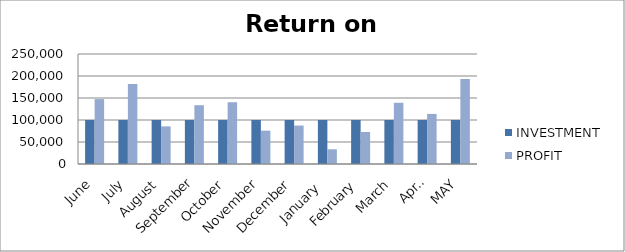
| Category | INVESTMENT  | PROFIT |
|---|---|---|
| June | 100000 | 147454 |
| July | 100000 | 181784 |
| August | 100000 | 85543 |
| September | 100000 | 133590 |
| October | 100000 | 140368 |
| November | 100000 | 75780 |
| December | 100000 | 87377 |
| January  | 100000 | 33435 |
| February | 100000 | 72800 |
| March | 100000 | 139150 |
| April | 100000 | 113802 |
| MAY | 100000 | 193325 |